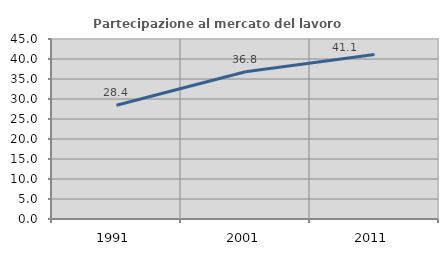
| Category | Partecipazione al mercato del lavoro  femminile |
|---|---|
| 1991.0 | 28.421 |
| 2001.0 | 36.797 |
| 2011.0 | 41.113 |